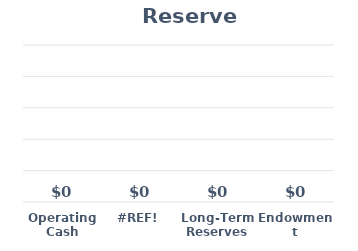
| Category | Series 0 |
|---|---|
| Operating Cash | 0 |
| #REF! | 0 |
| Long-Term Reserves | 0 |
| Endowment | 0 |